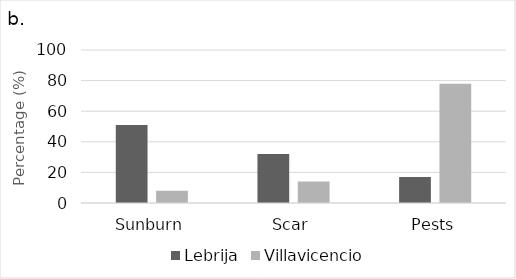
| Category | Lebrija | Villavicencio |
|---|---|---|
| Sunburn | 51 | 8 |
| Scar | 32 | 14 |
| Pests | 17 | 78 |